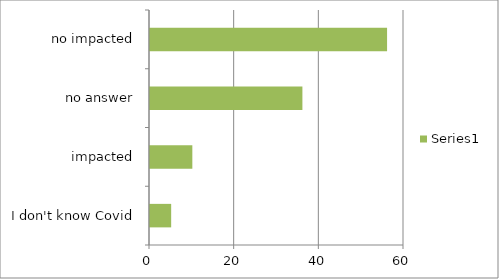
| Category | Series 0 |
|---|---|
| I don't know Covid | 5 |
| impacted | 10 |
| no answer | 36 |
| no impacted | 56 |